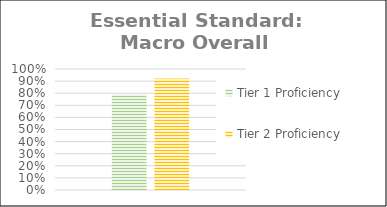
| Category | Tier 1 Proficiency | Tier 2 Proficiency |
|---|---|---|
| 0 | 0.789 | 0.921 |